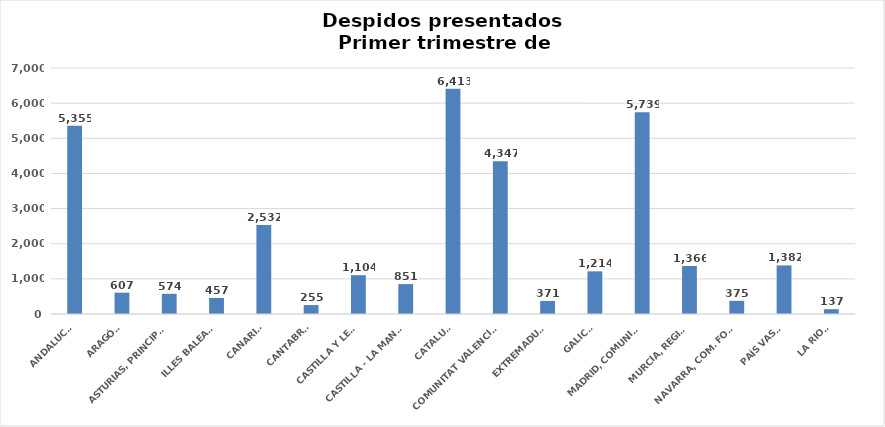
| Category | Series 0 |
|---|---|
| ANDALUCÍA | 5355 |
| ARAGÓN | 607 |
| ASTURIAS, PRINCIPADO | 574 |
| ILLES BALEARS | 457 |
| CANARIAS | 2532 |
| CANTABRIA | 255 |
| CASTILLA Y LEÓN | 1104 |
| CASTILLA - LA MANCHA | 851 |
| CATALUÑA | 6413 |
| COMUNITAT VALENCIANA | 4347 |
| EXTREMADURA | 371 |
| GALICIA | 1214 |
| MADRID, COMUNIDAD | 5739 |
| MURCIA, REGIÓN | 1366 |
| NAVARRA, COM. FORAL | 375 |
| PAÍS VASCO | 1382 |
| LA RIOJA | 137 |